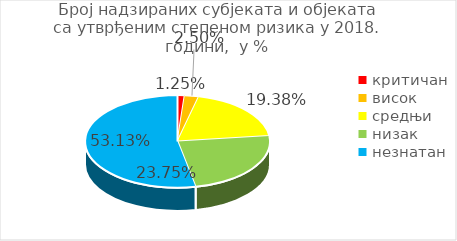
| Category | Series 0 |
|---|---|
| критичан | 0.012 |
| висок | 0.025 |
| средњи | 0.194 |
| низак | 0.238 |
| незнатан | 0.531 |